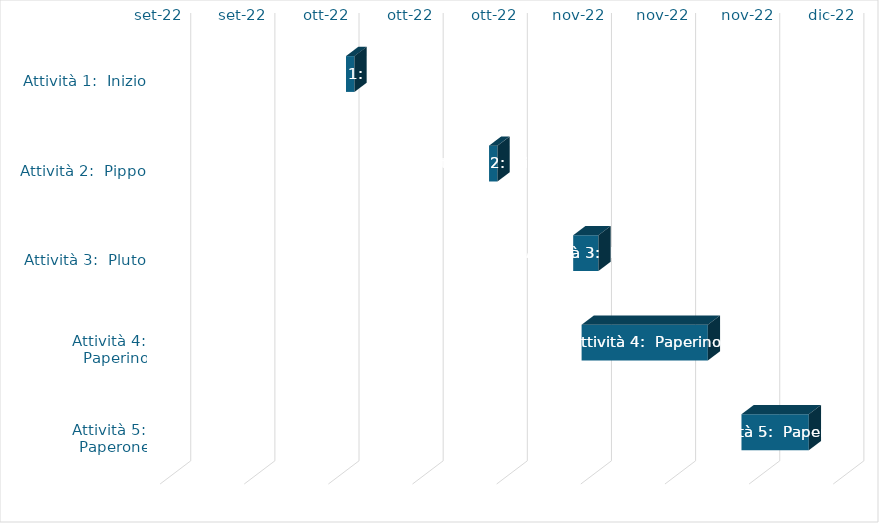
| Category | data | durata |
|---|---|---|
|  Attività 1:  Inizio | 07/10/2022 | 1 |
|  Attività 2:  Pippo | 24/10/2022 | 1 |
|  Attività 3:  Pluto | 03/11/2022 | 3 |
|  Attività 4:  Paperino | 04/11/2022 | 15 |
|  Attività 5:  Paperone | 23/11/2022 | 8 |